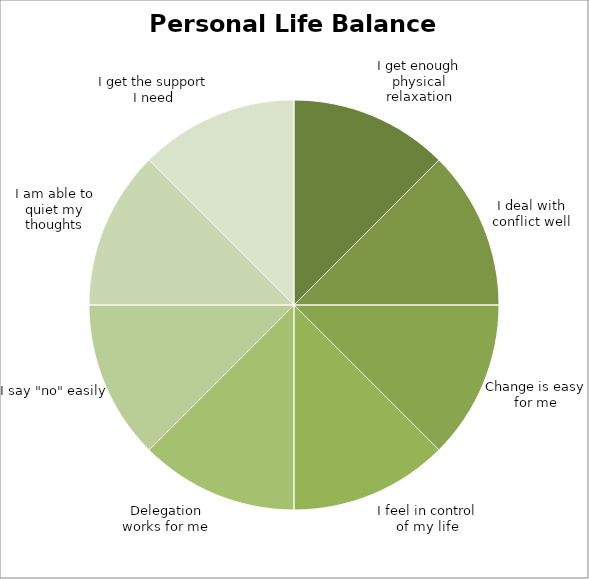
| Category | Series 0 |
|---|---|
| I get enough physical relaxation | 0.125 |
| I deal with conflict well | 0.125 |
| Change is easy for me | 0.125 |
| I feel in control of my life | 0.125 |
| Delegation works for me | 0.125 |
| I say "no" easily | 0.125 |
| I am able to quiet my thoughts | 0.125 |
| I get the support I need | 0.125 |